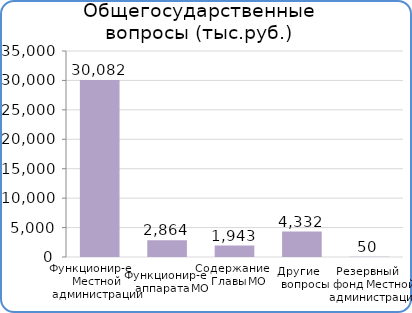
| Category | Расходы |
|---|---|
| Функционирование МА | 30081500 |
| Функционирование аппарата МО | 2863600 |
| Содержание Главы МО | 1943100 |
| Другие вопросы | 4332200 |
| Резервный фонд МА | 50000 |